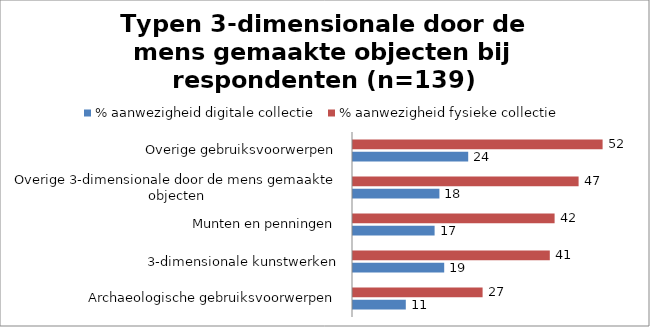
| Category | % aanwezigheid digitale collectie | % aanwezigheid fysieke collectie |
|---|---|---|
| Archaeologische gebruiksvoorwerpen | 11 | 27 |
| 3-dimensionale kunstwerken | 19 | 41 |
| Munten en penningen | 17 | 42 |
| Overige 3-dimensionale door de mens gemaakte objecten | 18 | 47 |
| Overige gebruiksvoorwerpen | 24 | 52 |